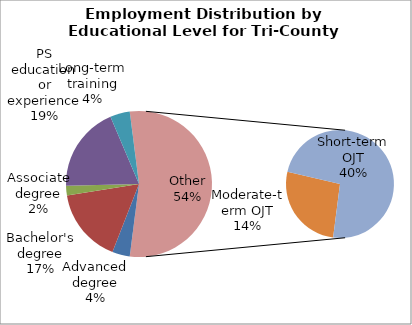
| Category | Series 0 |
|---|---|
| Advanced degree | 5660 |
| Bachelor's degree | 23990 |
| Associate degree | 3140 |
| PS education or experience | 27570 |
| Long-term training | 6330 |
| Moderate-term OJT | 20900 |
| Short-term OJT | 57580 |